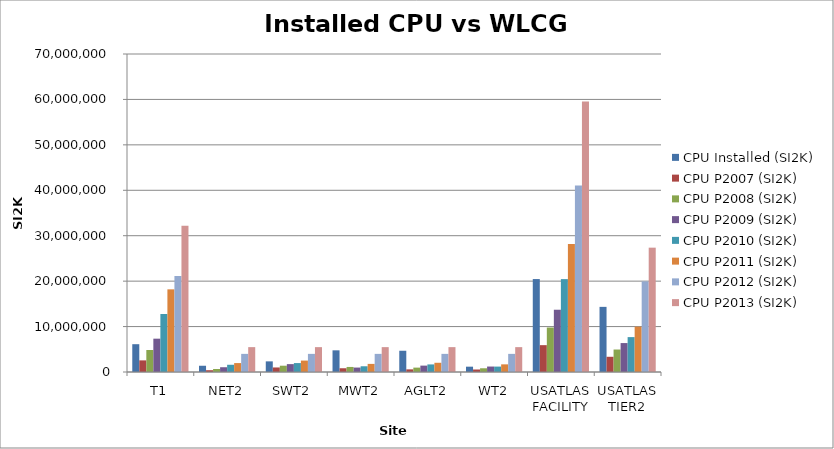
| Category | CPU Installed (SI2K) | CPU P2007 (SI2K) | CPU P2008 (SI2K) | CPU P2009 (SI2K) | CPU P2010 (SI2K) | CPU P2011 (SI2K) | CPU P2012 (SI2K) | CPU P2013 (SI2K) |
|---|---|---|---|---|---|---|---|---|
| T1 | 6120816 | 2560000 | 4844000 | 7337000 | 12765000 | 18193000 | 21132400 | 32200000 |
| NET2 | 1375816 | 394000 | 665000 | 1049000 | 1592000 | 1966000 | 3989600 | 5474000 |
| SWT2 | 2341916 | 998000 | 1386000 | 1734000 | 1966000 | 2514000 | 3989600 | 5474000 |
| MWT2 | 4770976 | 826000 | 1112000 | 978000 | 1262000 | 1785000 | 3989600 | 5474000 |
| AGLT2 | 4677868 | 581000 | 965000 | 1406000 | 1670000 | 2032000 | 3989600 | 5474000 |
| WT2 | 1171567.764 | 550000 | 820000 | 1202000 | 1191000 | 1685000 | 3989600 | 5474000 |
| USATLAS FACILITY | 20458959.764 | 5909000 | 9792000 | 13706000 | 20446000 | 28175000 | 41080400 | 59570000 |
| USATLAS TIER2 | 14338143.764 | 3349000 | 4948000 | 6369000 | 7681000 | 9982000 | 19948000 | 27370000 |